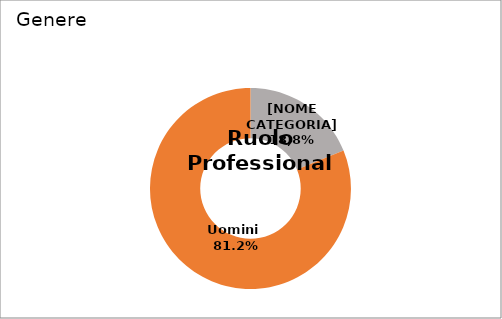
| Category | Series 0 |
|---|---|
| Donne  | 0.188 |
| Uomini  | 0.812 |